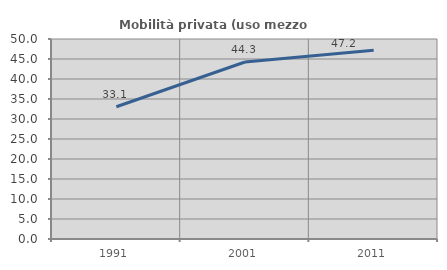
| Category | Mobilità privata (uso mezzo privato) |
|---|---|
| 1991.0 | 33.054 |
| 2001.0 | 44.255 |
| 2011.0 | 47.17 |